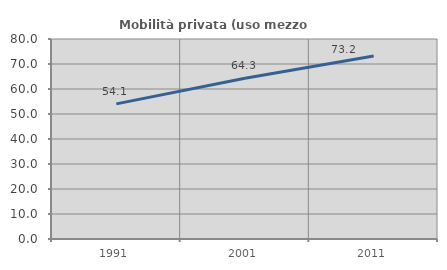
| Category | Mobilità privata (uso mezzo privato) |
|---|---|
| 1991.0 | 54.054 |
| 2001.0 | 64.262 |
| 2011.0 | 73.193 |